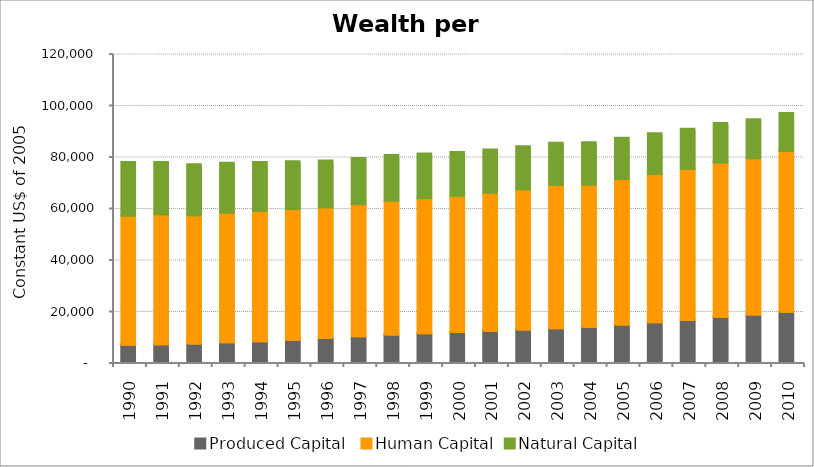
| Category | Produced Capital  | Human Capital | Natural Capital |
|---|---|---|---|
| 1990.0 | 6721.026 | 50145.199 | 20585.423 |
| 1991.0 | 6919.281 | 50431.12 | 20124.518 |
| 1992.0 | 7231.614 | 49766.739 | 19597.734 |
| 1993.0 | 7639.699 | 50422.203 | 19170.423 |
| 1994.0 | 8065.297 | 50619.71 | 18790.61 |
| 1995.0 | 8659.301 | 50724.192 | 18383.646 |
| 1996.0 | 9305.603 | 50785.284 | 18007.618 |
| 1997.0 | 10026.377 | 51321.321 | 17698.914 |
| 1998.0 | 10723.265 | 52020.544 | 17410.201 |
| 1999.0 | 11153.56 | 52577.469 | 17049.402 |
| 2000.0 | 11640.398 | 52959.077 | 16803.349 |
| 2001.0 | 12139.348 | 53681.652 | 16553.297 |
| 2002.0 | 12621.882 | 54428.528 | 16499.823 |
| 2003.0 | 13134.218 | 55678.378 | 16178.019 |
| 2004.0 | 13726.411 | 55212.023 | 16171.195 |
| 2005.0 | 14575.389 | 56458.593 | 15902.459 |
| 2006.0 | 15405.678 | 57611.51 | 15607.912 |
| 2007.0 | 16355.727 | 58664.036 | 15328.989 |
| 2008.0 | 17574.513 | 59920.39 | 15108.473 |
| 2009.0 | 18398.422 | 60769.072 | 14879.501 |
| 2010.0 | 19484.024 | 62417.592 | 14632.346 |